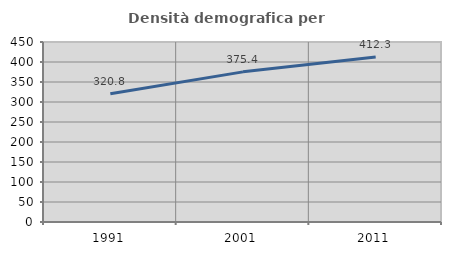
| Category | Densità demografica |
|---|---|
| 1991.0 | 320.822 |
| 2001.0 | 375.354 |
| 2011.0 | 412.348 |